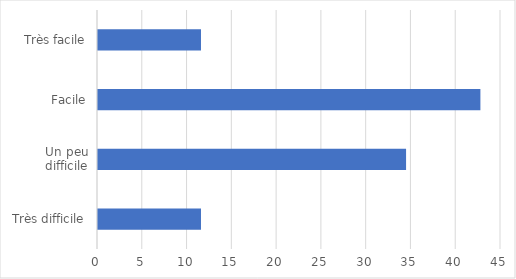
| Category | Series 0 |
|---|---|
| Très difficile | 11.5 |
| Un peu difficile | 34.4 |
| Facile | 42.7 |
| Très facile | 11.5 |